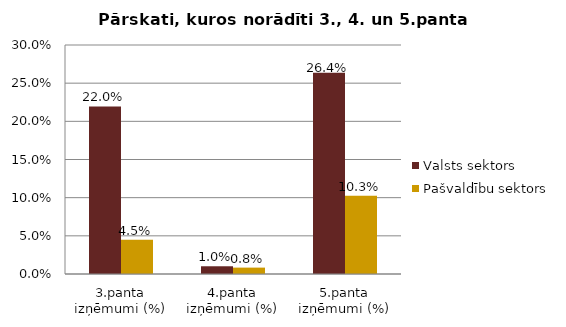
| Category | Valsts sektors | Pašvaldību sektors |
|---|---|---|
| 3.panta izņēmumi (%) | 0.22 | 0.045 |
| 4.panta izņēmumi (%) | 0.01 | 0.008 |
| 5.panta izņēmumi (%) | 0.264 | 0.103 |